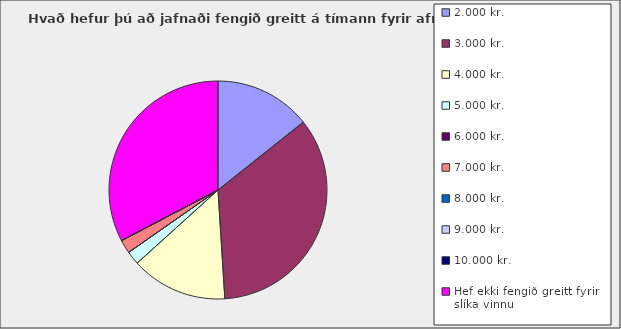
| Category | Series 0 |
|---|---|
| 2.000 kr. | 0.143 |
| 3.000 kr. | 0.347 |
| 4.000 kr. | 0.143 |
| 5.000 kr. | 0.02 |
| 6.000 kr. | 0 |
| 7.000 kr. | 0.02 |
| 8.000 kr. | 0 |
| 9.000 kr. | 0 |
| 10.000 kr. | 0 |
| Hef ekki fengið greitt fyrir slíka vinnu | 0.327 |